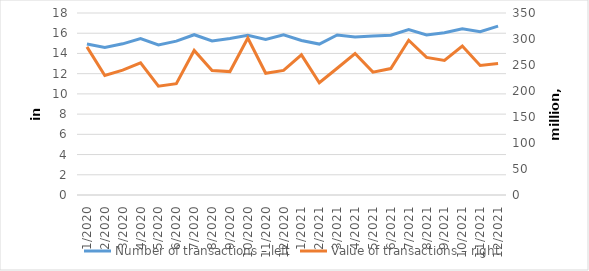
| Category | Number of transactions – left |
|---|---|
| 1/2020 | 14934534 |
| 2/2020 | 14581295 |
| 3/2020 | 14949924 |
| 4/2020 | 15475047 |
| 5/2020 | 14836361 |
| 6/2020 | 15221341 |
| 7/2020 | 15852587 |
| 8/2020 | 15230743 |
| 9/2020 | 15480174 |
| 10/2020 | 15793838 |
| 11/2020 | 15391839 |
| 12/2020 | 15841467 |
| 1/2021 | 15286372 |
| 2/2021 | 14928885 |
| 3/2021 | 15822612 |
| 4/2021 | 15615856 |
| 5/2021 | 15726566 |
| 6/2021 | 15798196 |
| 7/2021 | 16355712 |
| 8/2021 | 15821262 |
| 9/2021 | 16048157 |
| 10/2021 | 16429561 |
| 11/2021 | 16144002 |
| 12/2021 | 16705233 |